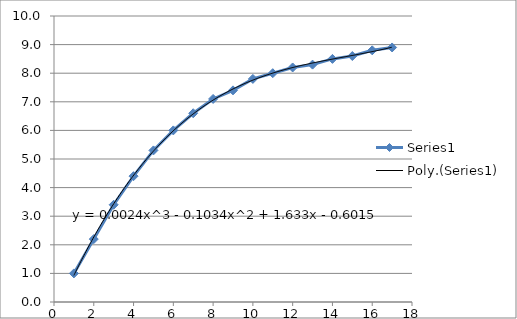
| Category | Series 0 |
|---|---|
| 1.0 | 1 |
| 2.0 | 2.2 |
| 3.0 | 3.4 |
| 4.0 | 4.4 |
| 5.0 | 5.3 |
| 6.0 | 6 |
| 7.0 | 6.6 |
| 8.0 | 7.1 |
| 9.0 | 7.4 |
| 10.0 | 7.8 |
| 11.0 | 8 |
| 12.0 | 8.2 |
| 13.0 | 8.3 |
| 14.0 | 8.5 |
| 15.0 | 8.6 |
| 16.0 | 8.8 |
| 17.0 | 8.9 |